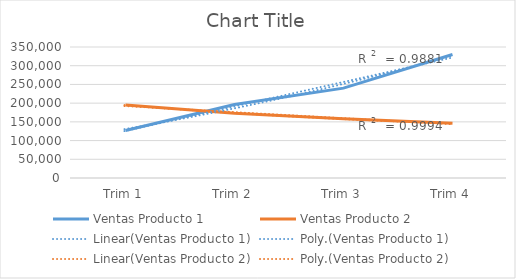
| Category | Ventas Producto 1 | Ventas Producto 2 |
|---|---|---|
| Trim 1 | 127000 | 195000 |
| Trim 2 | 196350 | 173000 |
| Trim 3 | 240095 | 158000 |
| Trim 4 | 330053 | 146000 |